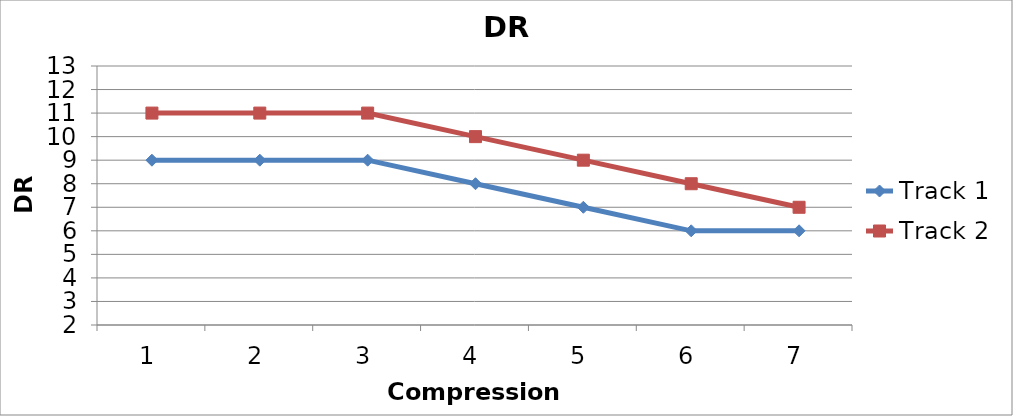
| Category | Track 1 | Track 2 |
|---|---|---|
| 0 | 9 | 11 |
| 1 | 9 | 11 |
| 2 | 9 | 11 |
| 3 | 8 | 10 |
| 4 | 7 | 9 |
| 5 | 6 | 8 |
| 6 | 6 | 7 |